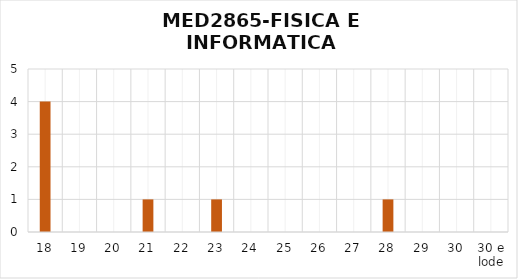
| Category | Series 0 |
|---|---|
| 18 | 4 |
| 19 | 0 |
| 20 | 0 |
| 21 | 1 |
| 22 | 0 |
| 23 | 1 |
| 24 | 0 |
| 25 | 0 |
| 26 | 0 |
| 27 | 0 |
| 28 | 1 |
| 29 | 0 |
| 30 | 0 |
| 30 e lode | 0 |